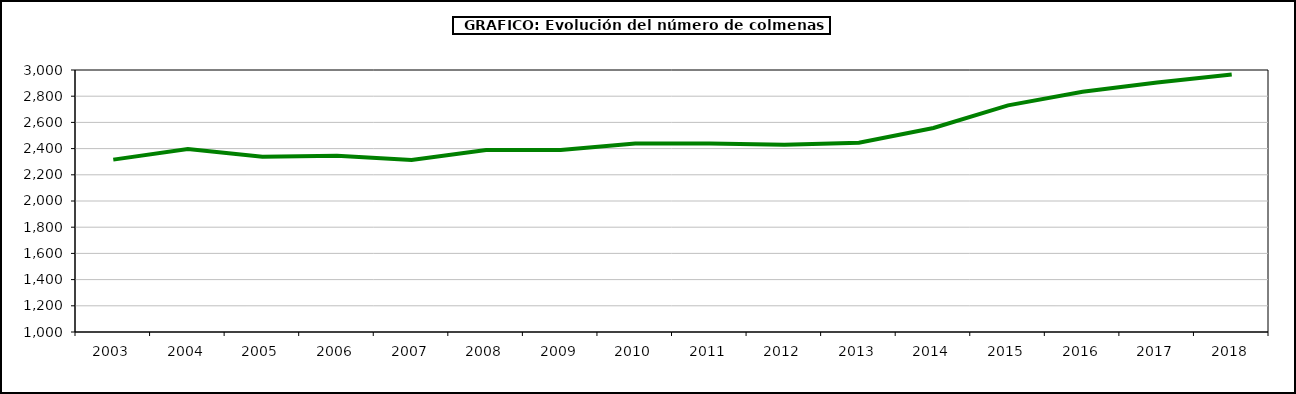
| Category | colmenas |
|---|---|
| 2003.0 | 2315.982 |
| 2004.0 | 2396.686 |
| 2005.0 | 2338.342 |
| 2006.0 | 2345.368 |
| 2007.0 | 2313.454 |
| 2008.0 | 2388.595 |
| 2009.0 | 2389.999 |
| 2010.0 | 2438 |
| 2011.0 | 2439.718 |
| 2012.0 | 2430.196 |
| 2013.0 | 2444.097 |
| 2014.0 | 2557.301 |
| 2015.0 | 2730.296 |
| 2016.0 | 2834.514 |
| 2017.0 | 2904.971 |
| 2018.0 | 2965.557 |